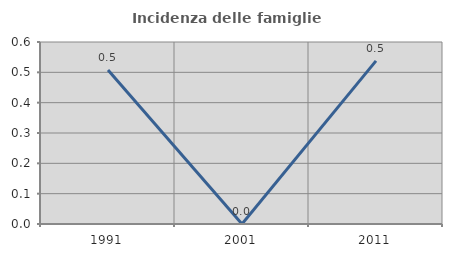
| Category | Incidenza delle famiglie numerose |
|---|---|
| 1991.0 | 0.508 |
| 2001.0 | 0 |
| 2011.0 | 0.538 |